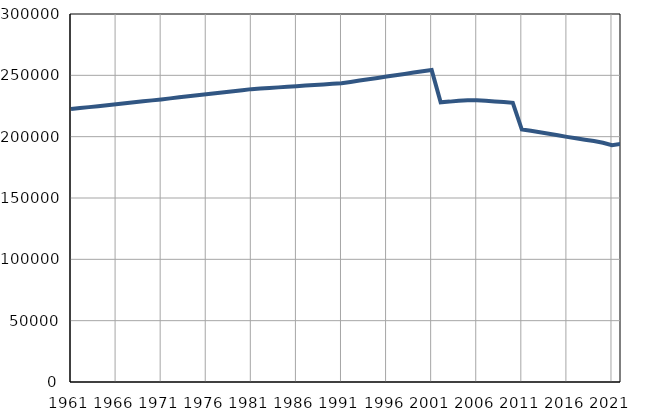
| Category | Population
size |
|---|---|
| 1961.0 | 222520 |
| 1962.0 | 223305 |
| 1963.0 | 224091 |
| 1964.0 | 224876 |
| 1965.0 | 225661 |
| 1966.0 | 226447 |
| 1967.0 | 227232 |
| 1968.0 | 228017 |
| 1969.0 | 228802 |
| 1970.0 | 229588 |
| 1971.0 | 230373 |
| 1972.0 | 231211 |
| 1973.0 | 232049 |
| 1974.0 | 232887 |
| 1975.0 | 233725 |
| 1976.0 | 234563 |
| 1977.0 | 235401 |
| 1978.0 | 236239 |
| 1979.0 | 237077 |
| 1980.0 | 237915 |
| 1981.0 | 238753 |
| 1982.0 | 239231 |
| 1983.0 | 239708 |
| 1984.0 | 240186 |
| 1985.0 | 240663 |
| 1986.0 | 241141 |
| 1987.0 | 241619 |
| 1988.0 | 242096 |
| 1989.0 | 242574 |
| 1990.0 | 243051 |
| 1991.0 | 243529 |
| 1992.0 | 244617 |
| 1993.0 | 245706 |
| 1994.0 | 246794 |
| 1995.0 | 247882 |
| 1996.0 | 248970 |
| 1997.0 | 250059 |
| 1998.0 | 251147 |
| 1999.0 | 252235 |
| 2000.0 | 253323 |
| 2001.0 | 254412 |
| 2002.0 | 227962 |
| 2003.0 | 228574 |
| 2004.0 | 229361 |
| 2005.0 | 229707 |
| 2006.0 | 229596 |
| 2007.0 | 229200 |
| 2008.0 | 228704 |
| 2009.0 | 228254 |
| 2010.0 | 227554 |
| 2011.0 | 205811 |
| 2012.0 | 204748 |
| 2013.0 | 203577 |
| 2014.0 | 202425 |
| 2015.0 | 201170 |
| 2016.0 | 199849 |
| 2017.0 | 198671 |
| 2018.0 | 197538 |
| 2019.0 | 196431 |
| 2020.0 | 195041 |
| 2021.0 | 193073 |
| 2022.0 | 194208 |